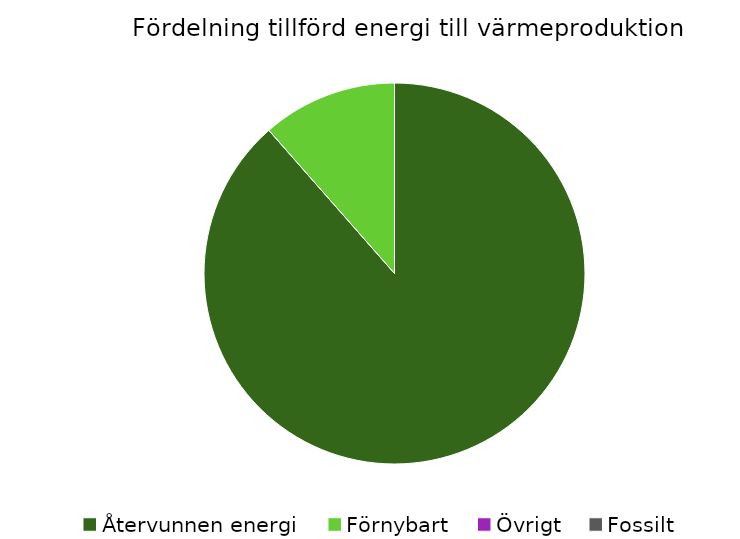
| Category | Fördelning värmeproduktion |
|---|---|
| Återvunnen energi | 0.885 |
| Förnybart | 0.115 |
| Övrigt | 0 |
| Fossilt | 0 |